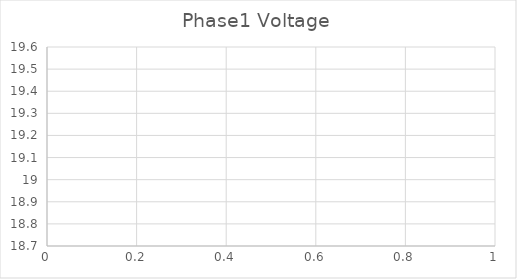
| Category | Phase1 Voltage |
|---|---|
| 0 | 19.384 |
| 1 | 19.386 |
| 2 | 19.392 |
| 3 | 19.393 |
| 4 | 19.385 |
| 5 | 19.382 |
| 6 | 19.375 |
| 7 | 19.376 |
| 8 | 19.385 |
| 9 | 19.391 |
| 10 | 19.393 |
| 11 | 19.396 |
| 12 | 19.393 |
| 13 | 19.386 |
| 14 | 19.386 |
| 15 | 19.399 |
| 16 | 19.406 |
| 17 | 19.404 |
| 18 | 19.398 |
| 19 | 19.395 |
| 20 | 19.395 |
| 21 | 19.399 |
| 22 | 19.397 |
| 23 | 19.391 |
| 24 | 19.39 |
| 25 | 19.39 |
| 26 | 19.381 |
| 27 | 19.385 |
| 28 | 19.391 |
| 29 | 19.395 |
| 30 | 19.395 |
| 31 | 19.386 |
| 32 | 19.379 |
| 33 | 19.376 |
| 34 | 19.378 |
| 35 | 19.382 |
| 36 | 19.383 |
| 37 | 19.378 |
| 38 | 19.38 |
| 39 | 19.385 |
| 40 | 19.385 |
| 41 | 19.395 |
| 42 | 19.398 |
| 43 | 19.406 |
| 44 | 19.413 |
| 45 | 19.424 |
| 46 | 19.431 |
| 47 | 19.432 |
| 48 | 19.431 |
| 49 | 19.422 |
| 50 | 19.413 |
| 51 | 19.402 |
| 52 | 19.402 |
| 53 | 19.414 |
| 54 | 19.42 |
| 55 | 19.422 |
| 56 | 19.429 |
| 57 | 19.432 |
| 58 | 19.442 |
| 59 | 19.446 |
| 60 | 19.448 |
| 61 | 19.446 |
| 62 | 19.446 |
| 63 | 19.443 |
| 64 | 19.447 |
| 65 | 19.446 |
| 66 | 19.435 |
| 67 | 19.431 |
| 68 | 19.425 |
| 69 | 19.425 |
| 70 | 19.432 |
| 71 | 19.435 |
| 72 | 19.435 |
| 73 | 19.441 |
| 74 | 19.445 |
| 75 | 19.445 |
| 76 | 19.449 |
| 77 | 19.442 |
| 78 | 19.441 |
| 79 | 19.44 |
| 80 | 19.439 |
| 81 | 19.441 |
| 82 | 19.441 |
| 83 | 19.443 |
| 84 | 19.446 |
| 85 | 19.441 |
| 86 | 19.438 |
| 87 | 19.436 |
| 88 | 19.444 |
| 89 | 19.447 |
| 90 | 19.45 |
| 91 | 19.45 |
| 92 | 19.451 |
| 93 | 19.452 |
| 94 | 19.446 |
| 95 | 19.445 |
| 96 | 19.45 |
| 97 | 19.451 |
| 98 | 19.453 |
| 99 | 19.455 |
| 100 | 19.453 |
| 101 | 19.457 |
| 102 | 19.458 |
| 103 | 19.462 |
| 104 | 19.462 |
| 105 | 19.462 |
| 106 | 19.465 |
| 107 | 19.472 |
| 108 | 19.476 |
| 109 | 19.474 |
| 110 | 19.472 |
| 111 | 19.468 |
| 112 | 19.467 |
| 113 | 19.468 |
| 114 | 19.467 |
| 115 | 19.465 |
| 116 | 19.457 |
| 117 | 19.459 |
| 118 | 19.463 |
| 119 | 19.46 |
| 120 | 19.454 |
| 121 | 19.454 |
| 122 | 19.451 |
| 123 | 19.446 |
| 124 | 19.449 |
| 125 | 19.452 |
| 126 | 19.456 |
| 127 | 19.457 |
| 128 | 19.457 |
| 129 | 19.457 |
| 130 | 19.462 |
| 131 | 19.464 |
| 132 | 19.462 |
| 133 | 19.462 |
| 134 | 19.457 |
| 135 | 19.456 |
| 136 | 19.459 |
| 137 | 19.455 |
| 138 | 19.456 |
| 139 | 19.462 |
| 140 | 19.466 |
| 141 | 19.465 |
| 142 | 19.457 |
| 143 | 19.458 |
| 144 | 19.46 |
| 145 | 19.466 |
| 146 | 19.467 |
| 147 | 19.469 |
| 148 | 19.467 |
| 149 | 19.47 |
| 150 | 19.47 |
| 151 | 19.473 |
| 152 | 19.472 |
| 153 | 19.472 |
| 154 | 19.464 |
| 155 | 19.457 |
| 156 | 19.455 |
| 157 | 19.455 |
| 158 | 19.463 |
| 159 | 19.462 |
| 160 | 19.457 |
| 161 | 19.453 |
| 162 | 19.45 |
| 163 | 19.449 |
| 164 | 19.454 |
| 165 | 19.451 |
| 166 | 19.451 |
| 167 | 19.454 |
| 168 | 19.464 |
| 169 | 19.464 |
| 170 | 19.46 |
| 171 | 19.454 |
| 172 | 19.454 |
| 173 | 19.461 |
| 174 | 19.461 |
| 175 | 19.459 |
| 176 | 19.46 |
| 177 | 19.463 |
| 178 | 19.473 |
| 179 | 19.476 |
| 180 | 19.478 |
| 181 | 19.482 |
| 182 | 19.482 |
| 183 | 19.483 |
| 184 | 19.485 |
| 185 | 19.484 |
| 186 | 19.485 |
| 187 | 19.49 |
| 188 | 19.49 |
| 189 | 19.488 |
| 190 | 19.491 |
| 191 | 19.506 |
| 192 | 19.508 |
| 193 | 19.495 |
| 194 | 19.489 |
| 195 | 19.485 |
| 196 | 19.485 |
| 197 | 19.482 |
| 198 | 19.48 |
| 199 | 19.481 |
| 200 | 19.482 |
| 201 | 19.484 |
| 202 | 19.477 |
| 203 | 19.474 |
| 204 | 19.473 |
| 205 | 19.472 |
| 206 | 19.473 |
| 207 | 19.473 |
| 208 | 19.476 |
| 209 | 19.479 |
| 210 | 19.48 |
| 211 | 19.473 |
| 212 | 19.47 |
| 213 | 19.475 |
| 214 | 19.48 |
| 215 | 19.483 |
| 216 | 19.48 |
| 217 | 19.479 |
| 218 | 19.483 |
| 219 | 19.48 |
| 220 | 19.475 |
| 221 | 19.478 |
| 222 | 19.477 |
| 223 | 19.473 |
| 224 | 19.47 |
| 225 | 19.47 |
| 226 | 19.472 |
| 227 | 19.473 |
| 228 | 19.471 |
| 229 | 19.468 |
| 230 | 19.462 |
| 231 | 19.459 |
| 232 | 19.444 |
| 233 | 19.463 |
| 234 | 19.466 |
| 235 | 19.468 |
| 236 | 19.467 |
| 237 | 19.469 |
| 238 | 19.474 |
| 239 | 19.476 |
| 240 | 19.476 |
| 241 | 19.478 |
| 242 | 19.48 |
| 243 | 19.484 |
| 244 | 19.482 |
| 245 | 19.478 |
| 246 | 19.471 |
| 247 | 19.471 |
| 248 | 19.47 |
| 249 | 19.465 |
| 250 | 19.463 |
| 251 | 19.466 |
| 252 | 19.464 |
| 253 | 19.464 |
| 254 | 19.459 |
| 255 | 19.456 |
| 256 | 19.449 |
| 257 | 19.445 |
| 258 | 19.439 |
| 259 | 19.436 |
| 260 | 19.439 |
| 261 | 19.444 |
| 262 | 19.454 |
| 263 | 19.457 |
| 264 | 19.461 |
| 265 | 19.461 |
| 266 | 19.46 |
| 267 | 19.463 |
| 268 | 19.463 |
| 269 | 19.461 |
| 270 | 19.468 |
| 271 | 19.471 |
| 272 | 19.471 |
| 273 | 19.472 |
| 274 | 19.477 |
| 275 | 19.483 |
| 276 | 19.48 |
| 277 | 19.47 |
| 278 | 19.469 |
| 279 | 19.474 |
| 280 | 19.481 |
| 281 | 19.481 |
| 282 | 19.479 |
| 283 | 19.478 |
| 284 | 19.473 |
| 285 | 19.471 |
| 286 | 19.476 |
| 287 | 19.48 |
| 288 | 19.482 |
| 289 | 19.484 |
| 290 | 19.491 |
| 291 | 19.494 |
| 292 | 19.494 |
| 293 | 19.487 |
| 294 | 19.486 |
| 295 | 19.484 |
| 296 | 19.475 |
| 297 | 19.473 |
| 298 | 19.473 |
| 299 | 19.47 |
| 300 | 19.479 |
| 301 | 19.484 |
| 302 | 19.485 |
| 303 | 19.487 |
| 304 | 19.496 |
| 305 | 19.495 |
| 306 | 19.514 |
| 307 | 19.522 |
| 308 | 19.513 |
| 309 | 19.513 |
| 310 | 19.514 |
| 311 | 19.516 |
| 312 | 19.517 |
| 313 | 19.516 |
| 314 | 19.514 |
| 315 | 19.51 |
| 316 | 19.504 |
| 317 | 19.506 |
| 318 | 19.508 |
| 319 | 19.507 |
| 320 | 19.503 |
| 321 | 19.501 |
| 322 | 19.5 |
| 323 | 19.5 |
| 324 | 19.499 |
| 325 | 19.494 |
| 326 | 19.494 |
| 327 | 19.495 |
| 328 | 19.49 |
| 329 | 19.491 |
| 330 | 19.495 |
| 331 | 19.496 |
| 332 | 19.501 |
| 333 | 19.498 |
| 334 | 19.494 |
| 335 | 19.492 |
| 336 | 19.489 |
| 337 | 19.487 |
| 338 | 19.489 |
| 339 | 19.487 |
| 340 | 19.484 |
| 341 | 19.49 |
| 342 | 19.493 |
| 343 | 19.491 |
| 344 | 19.49 |
| 345 | 19.488 |
| 346 | 19.487 |
| 347 | 19.49 |
| 348 | 19.492 |
| 349 | 19.493 |
| 350 | 19.492 |
| 351 | 19.488 |
| 352 | 19.487 |
| 353 | 19.485 |
| 354 | 19.479 |
| 355 | 19.475 |
| 356 | 19.47 |
| 357 | 19.462 |
| 358 | 19.463 |
| 359 | 19.463 |
| 360 | 19.467 |
| 361 | 19.466 |
| 362 | 19.467 |
| 363 | 19.466 |
| 364 | 19.461 |
| 365 | 19.457 |
| 366 | 19.452 |
| 367 | 19.452 |
| 368 | 19.454 |
| 369 | 19.458 |
| 370 | 19.455 |
| 371 | 19.444 |
| 372 | 19.441 |
| 373 | 19.449 |
| 374 | 19.454 |
| 375 | 19.454 |
| 376 | 19.452 |
| 377 | 19.444 |
| 378 | 19.443 |
| 379 | 19.441 |
| 380 | 19.421 |
| 381 | 19.435 |
| 382 | 19.432 |
| 383 | 19.427 |
| 384 | 19.428 |
| 385 | 19.43 |
| 386 | 19.43 |
| 387 | 19.43 |
| 388 | 19.436 |
| 389 | 19.438 |
| 390 | 19.44 |
| 391 | 19.442 |
| 392 | 19.447 |
| 393 | 19.455 |
| 394 | 19.455 |
| 395 | 19.454 |
| 396 | 19.449 |
| 397 | 19.446 |
| 398 | 19.45 |
| 399 | 19.452 |
| 400 | 19.454 |
| 401 | 19.455 |
| 402 | 19.453 |
| 403 | 19.453 |
| 404 | 19.45 |
| 405 | 19.45 |
| 406 | 19.453 |
| 407 | 19.451 |
| 408 | 19.453 |
| 409 | 19.46 |
| 410 | 19.46 |
| 411 | 19.452 |
| 412 | 19.449 |
| 413 | 19.447 |
| 414 | 19.449 |
| 415 | 19.45 |
| 416 | 19.444 |
| 417 | 19.429 |
| 418 | 19.426 |
| 419 | 19.402 |
| 420 | 19.398 |
| 421 | 19.418 |
| 422 | 19.421 |
| 423 | 19.422 |
| 424 | 19.428 |
| 425 | 19.43 |
| 426 | 19.435 |
| 427 | 19.441 |
| 428 | 19.442 |
| 429 | 19.439 |
| 430 | 19.438 |
| 431 | 19.439 |
| 432 | 19.435 |
| 433 | 19.43 |
| 434 | 19.424 |
| 435 | 19.425 |
| 436 | 19.429 |
| 437 | 19.43 |
| 438 | 19.43 |
| 439 | 19.432 |
| 440 | 19.434 |
| 441 | 19.435 |
| 442 | 19.431 |
| 443 | 19.417 |
| 444 | 19.414 |
| 445 | 19.413 |
| 446 | 19.396 |
| 447 | 19.388 |
| 448 | 19.38 |
| 449 | 19.363 |
| 450 | 19.343 |
| 451 | 19.323 |
| 452 | 19.304 |
| 453 | 19.301 |
| 454 | 19.296 |
| 455 | 19.301 |
| 456 | 19.319 |
| 457 | 19.329 |
| 458 | 19.341 |
| 459 | 19.349 |
| 460 | 19.35 |
| 461 | 19.354 |
| 462 | 19.356 |
| 463 | 19.364 |
| 464 | 19.366 |
| 465 | 19.368 |
| 466 | 19.357 |
| 467 | 19.349 |
| 468 | 19.342 |
| 469 | 19.334 |
| 470 | 19.328 |
| 471 | 19.33 |
| 472 | 19.331 |
| 473 | 19.331 |
| 474 | 19.326 |
| 475 | 19.323 |
| 476 | 19.32 |
| 477 | 19.32 |
| 478 | 19.32 |
| 479 | 19.325 |
| 480 | 19.329 |
| 481 | 19.331 |
| 482 | 19.33 |
| 483 | 19.32 |
| 484 | 19.308 |
| 485 | 19.303 |
| 486 | 19.306 |
| 487 | 19.307 |
| 488 | 19.307 |
| 489 | 19.303 |
| 490 | 19.299 |
| 491 | 19.299 |
| 492 | 19.301 |
| 493 | 19.299 |
| 494 | 19.296 |
| 495 | 19.295 |
| 496 | 19.284 |
| 497 | 19.286 |
| 498 | 19.29 |
| 499 | 19.289 |
| 500 | 19.405 |
| 501 | 19.41 |
| 502 | 19.421 |
| 503 | 19.403 |
| 504 | 19.402 |
| 505 | 19.402 |
| 506 | 19.406 |
| 507 | 19.412 |
| 508 | 19.417 |
| 509 | 19.419 |
| 510 | 19.424 |
| 511 | 19.424 |
| 512 | 19.425 |
| 513 | 19.428 |
| 514 | 19.43 |
| 515 | 19.417 |
| 516 | 19.415 |
| 517 | 19.411 |
| 518 | 19.409 |
| 519 | 19.41 |
| 520 | 19.416 |
| 521 | 19.415 |
| 522 | 19.412 |
| 523 | 19.41 |
| 524 | 19.409 |
| 525 | 19.41 |
| 526 | 19.411 |
| 527 | 19.411 |
| 528 | 19.408 |
| 529 | 19.408 |
| 530 | 19.41 |
| 531 | 19.411 |
| 532 | 19.409 |
| 533 | 19.409 |
| 534 | 19.404 |
| 535 | 19.404 |
| 536 | 19.407 |
| 537 | 19.407 |
| 538 | 19.353 |
| 539 | 19.336 |
| 540 | 19.336 |
| 541 | 19.279 |
| 542 | 19.275 |
| 543 | 19.279 |
| 544 | 19.284 |
| 545 | 19.294 |
| 546 | 19.301 |
| 547 | 19.297 |
| 548 | 19.295 |
| 549 | 19.295 |
| 550 | 18.837 |
| 551 | 18.833 |
| 552 | 19.293 |
| 553 | 19.295 |
| 554 | 19.293 |
| 555 | 19.292 |
| 556 | 19.287 |
| 557 | 19.289 |
| 558 | 19.289 |
| 559 | 19.29 |
| 560 | 19.291 |
| 561 | 19.287 |
| 562 | 19.286 |
| 563 | 19.292 |
| 564 | 19.293 |
| 565 | 19.299 |
| 566 | 19.3 |
| 567 | 19.298 |
| 568 | 19.296 |
| 569 | 19.299 |
| 570 | 19.186 |
| 571 | 19.156 |
| 572 | 19.156 |
| 573 | 19.299 |
| 574 | 19.404 |
| 575 | 19.399 |
| 576 | 19.367 |
| 577 | 19.366 |
| 578 | 19.391 |
| 579 | 19.397 |
| 580 | 19.343 |
| 581 | 19.343 |
| 582 | 19.364 |
| 583 | 19.358 |
| 584 | 19.377 |
| 585 | 19.398 |
| 586 | 19.411 |
| 587 | 19.42 |
| 588 | 19.437 |
| 589 | 19.451 |
| 590 | 19.458 |
| 591 | 19.467 |
| 592 | 19.47 |
| 593 | 19.469 |
| 594 | 19.466 |
| 595 | 19.457 |
| 596 | 19.459 |
| 597 | 19.467 |
| 598 | 19.468 |
| 599 | 19.471 |
| 600 | 19.47 |
| 601 | 19.468 |
| 602 | 19.467 |
| 603 | 19.465 |
| 604 | 19.462 |
| 605 | 19.466 |
| 606 | 19.465 |
| 607 | 19.466 |
| 608 | 19.472 |
| 609 | 19.48 |
| 610 | 19.482 |
| 611 | 19.487 |
| 612 | 19.483 |
| 613 | 19.478 |
| 614 | 19.474 |
| 615 | 19.471 |
| 616 | 19.476 |
| 617 | 19.488 |
| 618 | 19.483 |
| 619 | 19.473 |
| 620 | 19.469 |
| 621 | 19.477 |
| 622 | 19.482 |
| 623 | 19.477 |
| 624 | 19.457 |
| 625 | 19.46 |
| 626 | 19.475 |
| 627 | 19.48 |
| 628 | 19.465 |
| 629 | 19.465 |
| 630 | 19.475 |
| 631 | 19.474 |
| 632 | 19.468 |
| 633 | 19.477 |
| 634 | 19.48 |
| 635 | 19.504 |
| 636 | 19.491 |
| 637 | 19.469 |
| 638 | 19.471 |
| 639 | 19.472 |
| 640 | 19.473 |
| 641 | 19.478 |
| 642 | 19.478 |
| 643 | 19.476 |
| 644 | 19.473 |
| 645 | 19.48 |
| 646 | 19.484 |
| 647 | 19.48 |
| 648 | 19.475 |
| 649 | 19.48 |
| 650 | 19.479 |
| 651 | 19.477 |
| 652 | 19.477 |
| 653 | 19.476 |
| 654 | 19.479 |
| 655 | 19.473 |
| 656 | 19.47 |
| 657 | 19.467 |
| 658 | 19.471 |
| 659 | 19.473 |
| 660 | 19.471 |
| 661 | 19.461 |
| 662 | 19.458 |
| 663 | 19.454 |
| 664 | 19.456 |
| 665 | 19.458 |
| 666 | 19.447 |
| 667 | 19.442 |
| 668 | 19.447 |
| 669 | 19.448 |
| 670 | 19.457 |
| 671 | 19.455 |
| 672 | 19.448 |
| 673 | 19.442 |
| 674 | 19.427 |
| 675 | 19.427 |
| 676 | 19.435 |
| 677 | 19.439 |
| 678 | 19.448 |
| 679 | 19.449 |
| 680 | 19.447 |
| 681 | 19.437 |
| 682 | 19.434 |
| 683 | 19.434 |
| 684 | 19.439 |
| 685 | 19.441 |
| 686 | 19.437 |
| 687 | 19.439 |
| 688 | 19.445 |
| 689 | 19.445 |
| 690 | 19.44 |
| 691 | 19.435 |
| 692 | 19.436 |
| 693 | 19.436 |
| 694 | 19.435 |
| 695 | 19.442 |
| 696 | 19.445 |
| 697 | 19.454 |
| 698 | 19.449 |
| 699 | 19.447 |
| 700 | 19.446 |
| 701 | 19.445 |
| 702 | 19.445 |
| 703 | 19.442 |
| 704 | 19.441 |
| 705 | 19.439 |
| 706 | 19.435 |
| 707 | 19.431 |
| 708 | 19.432 |
| 709 | 19.433 |
| 710 | 19.439 |
| 711 | 19.442 |
| 712 | 19.44 |
| 713 | 19.443 |
| 714 | 19.445 |
| 715 | 19.444 |
| 716 | 19.44 |
| 717 | 19.44 |
| 718 | 19.435 |
| 719 | 19.431 |
| 720 | 19.43 |
| 721 | 19.438 |
| 722 | 19.443 |
| 723 | 19.441 |
| 724 | 19.443 |
| 725 | 19.452 |
| 726 | 19.454 |
| 727 | 19.459 |
| 728 | 19.468 |
| 729 | 19.474 |
| 730 | 19.476 |
| 731 | 19.474 |
| 732 | 19.474 |
| 733 | 19.474 |
| 734 | 19.472 |
| 735 | 19.465 |
| 736 | 19.463 |
| 737 | 19.467 |
| 738 | 19.47 |
| 739 | 19.462 |
| 740 | 19.459 |
| 741 | 19.456 |
| 742 | 19.457 |
| 743 | 19.466 |
| 744 | 19.466 |
| 745 | 19.46 |
| 746 | 19.454 |
| 747 | 19.452 |
| 748 | 19.458 |
| 749 | 19.468 |
| 750 | 19.472 |
| 751 | 19.469 |
| 752 | 19.474 |
| 753 | 19.475 |
| 754 | 19.474 |
| 755 | 19.467 |
| 756 | 19.467 |
| 757 | 19.466 |
| 758 | 19.477 |
| 759 | 19.479 |
| 760 | 19.478 |
| 761 | 19.471 |
| 762 | 19.467 |
| 763 | 19.478 |
| 764 | 19.478 |
| 765 | 19.489 |
| 766 | 19.489 |
| 767 | 19.483 |
| 768 | 19.48 |
| 769 | 19.48 |
| 770 | 19.47 |
| 771 | 19.454 |
| 772 | 19.445 |
| 773 | 19.415 |
| 774 | 19.418 |
| 775 | 19.458 |
| 776 | 19.477 |
| 777 | 19.528 |
| 778 | 19.524 |
| 779 | 19.488 |
| 780 | 19.475 |
| 781 | 19.465 |
| 782 | 19.474 |
| 783 | 19.485 |
| 784 | 19.453 |
| 785 | 19.438 |
| 786 | 19.447 |
| 787 | 19.448 |
| 788 | 19.438 |
| 789 | 19.381 |
| 790 | 19.362 |
| 791 | 19.378 |
| 792 | 19.379 |
| 793 | 19.392 |
| 794 | 19.406 |
| 795 | 19.453 |
| 796 | 19.479 |
| 797 | 19.508 |
| 798 | 19.508 |
| 799 | 19.492 |
| 800 | 19.495 |
| 801 | 19.497 |
| 802 | 19.488 |
| 803 | 19.469 |
| 804 | 19.449 |
| 805 | 19.393 |
| 806 | 19.351 |
| 807 | 19.305 |
| 808 | 19.318 |
| 809 | 19.341 |
| 810 | 19.377 |
| 811 | 19.413 |
| 812 | 19.463 |
| 813 | 19.499 |
| 814 | 19.536 |
| 815 | 19.514 |
| 816 | 19.493 |
| 817 | 19.47 |
| 818 | 19.455 |
| 819 | 19.445 |
| 820 | 19.439 |
| 821 | 19.443 |
| 822 | 19.447 |
| 823 | 19.446 |
| 824 | 19.434 |
| 825 | 19.427 |
| 826 | 19.422 |
| 827 | 19.409 |
| 828 | 19.417 |
| 829 | 19.425 |
| 830 | 19.451 |
| 831 | 19.458 |
| 832 | 19.461 |
| 833 | 19.451 |
| 834 | 19.451 |
| 835 | 19.455 |
| 836 | 19.457 |
| 837 | 19.462 |
| 838 | 19.456 |
| 839 | 19.443 |
| 840 | 19.442 |
| 841 | 19.436 |
| 842 | 19.421 |
| 843 | 19.414 |
| 844 | 19.415 |
| 845 | 19.429 |
| 846 | 19.436 |
| 847 | 19.438 |
| 848 | 19.444 |
| 849 | 19.454 |
| 850 | 19.469 |
| 851 | 19.462 |
| 852 | 19.401 |
| 853 | 19.399 |
| 854 | 19.399 |
| 855 | 19.443 |
| 856 | 19.445 |
| 857 | 19.444 |
| 858 | 19.438 |
| 859 | 19.425 |
| 860 | 19.417 |
| 861 | 19.368 |
| 862 | 19.423 |
| 863 | 19.43 |
| 864 | 19.437 |
| 865 | 19.437 |
| 866 | 19.436 |
| 867 | 19.426 |
| 868 | 19.42 |
| 869 | 19.42 |
| 870 | 19.421 |
| 871 | 19.418 |
| 872 | 19.415 |
| 873 | 19.422 |
| 874 | 19.424 |
| 875 | 19.431 |
| 876 | 19.432 |
| 877 | 19.429 |
| 878 | 19.425 |
| 879 | 19.425 |
| 880 | 19.412 |
| 881 | 19.408 |
| 882 | 19.403 |
| 883 | 19.404 |
| 884 | 19.411 |
| 885 | 19.418 |
| 886 | 19.43 |
| 887 | 19.43 |
| 888 | 19.43 |
| 889 | 19.428 |
| 890 | 19.428 |
| 891 | 19.431 |
| 892 | 19.431 |
| 893 | 19.43 |
| 894 | 19.426 |
| 895 | 19.42 |
| 896 | 19.413 |
| 897 | 19.415 |
| 898 | 19.415 |
| 899 | 19.414 |
| 900 | 19.414 |
| 901 | 19.411 |
| 902 | 19.408 |
| 903 | 19.409 |
| 904 | 19.413 |
| 905 | 19.413 |
| 906 | 19.415 |
| 907 | 19.415 |
| 908 | 19.413 |
| 909 | 19.411 |
| 910 | 19.408 |
| 911 | 19.386 |
| 912 | 19.386 |
| 913 | 19.406 |
| 914 | 19.417 |
| 915 | 19.416 |
| 916 | 19.413 |
| 917 | 19.413 |
| 918 | 19.41 |
| 919 | 19.408 |
| 920 | 19.411 |
| 921 | 19.41 |
| 922 | 19.412 |
| 923 | 19.413 |
| 924 | 19.41 |
| 925 | 19.405 |
| 926 | 19.393 |
| 927 | 19.388 |
| 928 | 19.382 |
| 929 | 19.388 |
| 930 | 19.39 |
| 931 | 19.388 |
| 932 | 19.385 |
| 933 | 19.387 |
| 934 | 19.388 |
| 935 | 19.374 |
| 936 | 19.374 |
| 937 | 19.386 |
| 938 | 19.396 |
| 939 | 19.402 |
| 940 | 19.398 |
| 941 | 19.398 |
| 942 | 19.405 |
| 943 | 19.405 |
| 944 | 19.404 |
| 945 | 19.407 |
| 946 | 19.413 |
| 947 | 19.414 |
| 948 | 19.413 |
| 949 | 19.407 |
| 950 | 19.4 |
| 951 | 19.399 |
| 952 | 19.399 |
| 953 | 19.395 |
| 954 | 19.394 |
| 955 | 19.393 |
| 956 | 19.394 |
| 957 | 19.395 |
| 958 | 19.394 |
| 959 | 19.389 |
| 960 | 19.388 |
| 961 | 19.383 |
| 962 | 19.38 |
| 963 | 19.385 |
| 964 | 19.389 |
| 965 | 19.389 |
| 966 | 19.382 |
| 967 | 19.379 |
| 968 | 19.38 |
| 969 | 19.38 |
| 970 | 19.379 |
| 971 | 19.374 |
| 972 | 19.374 |
| 973 | 19.376 |
| 974 | 19.375 |
| 975 | 19.377 |
| 976 | 19.38 |
| 977 | 19.39 |
| 978 | 19.392 |
| 979 | 19.39 |
| 980 | 19.386 |
| 981 | 19.388 |
| 982 | 19.381 |
| 983 | 19.381 |
| 984 | 19.378 |
| 985 | 19.382 |
| 986 | 19.38 |
| 987 | 19.369 |
| 988 | 19.369 |
| 989 | 19.376 |
| 990 | 19.373 |
| 991 | 19.37 |
| 992 | 19.366 |
| 993 | 19.371 |
| 994 | 19.378 |
| 995 | 19.38 |
| 996 | 19.378 |
| 997 | 19.374 |
| 998 | 19.375 |
| 999 | 19.375 |
| 1000 | 19.375 |
| 1001 | 19.366 |
| 1002 | 19.36 |
| 1003 | 19.358 |
| 1004 | 19.357 |
| 1005 | 19.362 |
| 1006 | 19.365 |
| 1007 | 19.364 |
| 1008 | 19.364 |
| 1009 | 19.368 |
| 1010 | 19.377 |
| 1011 | 19.381 |
| 1012 | 19.379 |
| 1013 | 19.377 |
| 1014 | 19.381 |
| 1015 | 19.384 |
| 1016 | 19.382 |
| 1017 | 19.381 |
| 1018 | 19.38 |
| 1019 | 19.383 |
| 1020 | 19.384 |
| 1021 | 19.381 |
| 1022 | 19.378 |
| 1023 | 19.378 |
| 1024 | 19.378 |
| 1025 | 19.379 |
| 1026 | 19.38 |
| 1027 | 19.38 |
| 1028 | 19.385 |
| 1029 | 19.386 |
| 1030 | 19.381 |
| 1031 | 19.378 |
| 1032 | 19.374 |
| 1033 | 19.369 |
| 1034 | 19.372 |
| 1035 | 19.372 |
| 1036 | 19.372 |
| 1037 | 19.373 |
| 1038 | 19.377 |
| 1039 | 19.379 |
| 1040 | 19.377 |
| 1041 | 19.374 |
| 1042 | 19.365 |
| 1043 | 19.363 |
| 1044 | 19.362 |
| 1045 | 19.363 |
| 1046 | 19.369 |
| 1047 | 19.362 |
| 1048 | 19.359 |
| 1049 | 19.358 |
| 1050 | 19.356 |
| 1051 | 19.355 |
| 1052 | 19.35 |
| 1053 | 19.345 |
| 1054 | 19.339 |
| 1055 | 19.337 |
| 1056 | 19.337 |
| 1057 | 19.335 |
| 1058 | 19.336 |
| 1059 | 19.34 |
| 1060 | 19.346 |
| 1061 | 19.346 |
| 1062 | 19.342 |
| 1063 | 19.339 |
| 1064 | 19.337 |
| 1065 | 19.337 |
| 1066 | 19.337 |
| 1067 | 19.334 |
| 1068 | 19.332 |
| 1069 | 19.33 |
| 1070 | 19.327 |
| 1071 | 19.325 |
| 1072 | 19.32 |
| 1073 | 19.324 |
| 1074 | 19.327 |
| 1075 | 19.327 |
| 1076 | 19.325 |
| 1077 | 19.324 |
| 1078 | 19.324 |
| 1079 | 19.32 |
| 1080 | 19.319 |
| 1081 | 19.315 |
| 1082 | 19.314 |
| 1083 | 19.314 |
| 1084 | 19.313 |
| 1085 | 19.314 |
| 1086 | 19.313 |
| 1087 | 19.314 |
| 1088 | 19.314 |
| 1089 | 19.313 |
| 1090 | 19.316 |
| 1091 | 19.318 |
| 1092 | 19.32 |
| 1093 | 19.32 |
| 1094 | 19.319 |
| 1095 | 19.315 |
| 1096 | 19.314 |
| 1097 | 19.314 |
| 1098 | 19.314 |
| 1099 | 19.31 |
| 1100 | 19.308 |
| 1101 | 19.304 |
| 1102 | 19.305 |
| 1103 | 19.307 |
| 1104 | 19.308 |
| 1105 | 19.31 |
| 1106 | 19.315 |
| 1107 | 19.317 |
| 1108 | 19.324 |
| 1109 | 19.325 |
| 1110 | 19.327 |
| 1111 | 19.325 |
| 1112 | 19.325 |
| 1113 | 19.332 |
| 1114 | 19.337 |
| 1115 | 19.334 |
| 1116 | 19.332 |
| 1117 | 19.332 |
| 1118 | 19.33 |
| 1119 | 19.325 |
| 1120 | 19.325 |
| 1121 | 19.324 |
| 1122 | 19.313 |
| 1123 | 19.31 |
| 1124 | 19.302 |
| 1125 | 19.298 |
| 1126 | 19.298 |
| 1127 | 19.297 |
| 1128 | 19.291 |
| 1129 | 19.289 |
| 1130 | 19.285 |
| 1131 | 19.284 |
| 1132 | 19.284 |
| 1133 | 19.28 |
| 1134 | 19.278 |
| 1135 | 19.271 |
| 1136 | 19.244 |
| 1137 | 19.243 |
| 1138 | 19.265 |
| 1139 | 19.267 |
| 1140 | 19.267 |
| 1141 | 19.27 |
| 1142 | 19.271 |
| 1143 | 19.286 |
| 1144 | 19.286 |
| 1145 | 19.271 |
| 1146 | 19.271 |
| 1147 | 19.279 |
| 1148 | 19.288 |
| 1149 | 19.289 |
| 1150 | 19.295 |
| 1151 | 19.302 |
| 1152 | 19.302 |
| 1153 | 19.301 |
| 1154 | 19.302 |
| 1155 | 19.305 |
| 1156 | 19.305 |
| 1157 | 19.309 |
| 1158 | 19.312 |
| 1159 | 19.309 |
| 1160 | 19.307 |
| 1161 | 19.311 |
| 1162 | 19.31 |
| 1163 | 19.312 |
| 1164 | 19.314 |
| 1165 | 19.313 |
| 1166 | 19.308 |
| 1167 | 19.306 |
| 1168 | 19.297 |
| 1169 | 19.299 |
| 1170 | 19.305 |
| 1171 | 19.306 |
| 1172 | 19.308 |
| 1173 | 19.309 |
| 1174 | 19.31 |
| 1175 | 19.312 |
| 1176 | 19.31 |
| 1177 | 19.309 |
| 1178 | 19.31 |
| 1179 | 19.308 |
| 1180 | 19.307 |
| 1181 | 19.308 |
| 1182 | 19.311 |
| 1183 | 19.314 |
| 1184 | 19.314 |
| 1185 | 19.315 |
| 1186 | 19.319 |
| 1187 | 19.314 |
| 1188 | 19.316 |
| 1189 | 19.318 |
| 1190 | 19.313 |
| 1191 | 19.306 |
| 1192 | 19.304 |
| 1193 | 19.305 |
| 1194 | 19.301 |
| 1195 | 19.3 |
| 1196 | 19.296 |
| 1197 | 19.298 |
| 1198 | 19.302 |
| 1199 | 19.3 |
| 1200 | 19.298 |
| 1201 | 19.295 |
| 1202 | 19.295 |
| 1203 | 19.301 |
| 1204 | 19.303 |
| 1205 | 19.305 |
| 1206 | 19.303 |
| 1207 | 19.304 |
| 1208 | 19.309 |
| 1209 | 19.311 |
| 1210 | 19.308 |
| 1211 | 19.306 |
| 1212 | 19.303 |
| 1213 | 19.31 |
| 1214 | 19.316 |
| 1215 | 19.321 |
| 1216 | 19.318 |
| 1217 | 19.318 |
| 1218 | 19.321 |
| 1219 | 19.324 |
| 1220 | 19.324 |
| 1221 | 19.324 |
| 1222 | 19.317 |
| 1223 | 19.318 |
| 1224 | 19.324 |
| 1225 | 19.325 |
| 1226 | 19.326 |
| 1227 | 19.326 |
| 1228 | 19.324 |
| 1229 | 19.329 |
| 1230 | 19.331 |
| 1231 | 19.328 |
| 1232 | 19.324 |
| 1233 | 19.326 |
| 1234 | 19.33 |
| 1235 | 19.328 |
| 1236 | 19.328 |
| 1237 | 19.328 |
| 1238 | 19.332 |
| 1239 | 19.335 |
| 1240 | 19.334 |
| 1241 | 19.334 |
| 1242 | 19.333 |
| 1243 | 19.333 |
| 1244 | 19.335 |
| 1245 | 19.337 |
| 1246 | 19.34 |
| 1247 | 19.339 |
| 1248 | 19.338 |
| 1249 | 19.338 |
| 1250 | 19.338 |
| 1251 | 19.343 |
| 1252 | 19.349 |
| 1253 | 19.349 |
| 1254 | 19.349 |
| 1255 | 19.349 |
| 1256 | 19.345 |
| 1257 | 19.34 |
| 1258 | 19.342 |
| 1259 | 19.346 |
| 1260 | 19.349 |
| 1261 | 19.354 |
| 1262 | 19.356 |
| 1263 | 19.357 |
| 1264 | 19.354 |
| 1265 | 19.357 |
| 1266 | 19.352 |
| 1267 | 19.348 |
| 1268 | 19.34 |
| 1269 | 19.345 |
| 1270 | 19.349 |
| 1271 | 19.355 |
| 1272 | 19.357 |
| 1273 | 19.359 |
| 1274 | 19.36 |
| 1275 | 19.361 |
| 1276 | 19.357 |
| 1277 | 19.353 |
| 1278 | 19.352 |
| 1279 | 19.349 |
| 1280 | 19.35 |
| 1281 | 19.351 |
| 1282 | 19.345 |
| 1283 | 19.344 |
| 1284 | 19.347 |
| 1285 | 19.343 |
| 1286 | 19.342 |
| 1287 | 19.347 |
| 1288 | 19.344 |
| 1289 | 19.343 |
| 1290 | 19.345 |
| 1291 | 19.35 |
| 1292 | 19.35 |
| 1293 | 19.353 |
| 1294 | 19.355 |
| 1295 | 19.356 |
| 1296 | 19.356 |
| 1297 | 19.353 |
| 1298 | 19.352 |
| 1299 | 19.354 |
| 1300 | 19.356 |
| 1301 | 19.353 |
| 1302 | 19.349 |
| 1303 | 19.347 |
| 1304 | 19.348 |
| 1305 | 19.348 |
| 1306 | 19.346 |
| 1307 | 19.344 |
| 1308 | 19.344 |
| 1309 | 19.342 |
| 1310 | 19.344 |
| 1311 | 19.347 |
| 1312 | 19.344 |
| 1313 | 19.342 |
| 1314 | 19.341 |
| 1315 | 19.342 |
| 1316 | 19.343 |
| 1317 | 19.345 |
| 1318 | 19.347 |
| 1319 | 19.348 |
| 1320 | 19.345 |
| 1321 | 19.343 |
| 1322 | 19.339 |
| 1323 | 19.34 |
| 1324 | 19.34 |
| 1325 | 19.347 |
| 1326 | 19.352 |
| 1327 | 19.349 |
| 1328 | 19.349 |
| 1329 | 19.35 |
| 1330 | 19.354 |
| 1331 | 19.351 |
| 1332 | 19.352 |
| 1333 | 19.358 |
| 1334 | 19.362 |
| 1335 | 19.354 |
| 1336 | 19.353 |
| 1337 | 19.356 |
| 1338 | 19.357 |
| 1339 | 19.361 |
| 1340 | 19.363 |
| 1341 | 19.368 |
| 1342 | 19.368 |
| 1343 | 19.368 |
| 1344 | 19.369 |
| 1345 | 19.375 |
| 1346 | 19.379 |
| 1347 | 19.388 |
| 1348 | 19.39 |
| 1349 | 19.389 |
| 1350 | 19.408 |
| 1351 | 19.408 |
| 1352 | 19.408 |
| 1353 | 19.406 |
| 1354 | 19.406 |
| 1355 | 19.4 |
| 1356 | 19.402 |
| 1357 | 19.406 |
| 1358 | 19.403 |
| 1359 | 19.4 |
| 1360 | 19.398 |
| 1361 | 19.407 |
| 1362 | 19.409 |
| 1363 | 19.409 |
| 1364 | 19.407 |
| 1365 | 19.408 |
| 1366 | 19.409 |
| 1367 | 19.406 |
| 1368 | 19.406 |
| 1369 | 19.411 |
| 1370 | 19.413 |
| 1371 | 19.417 |
| 1372 | 19.419 |
| 1373 | 19.42 |
| 1374 | 19.417 |
| 1375 | 19.413 |
| 1376 | 19.413 |
| 1377 | 19.417 |
| 1378 | 19.421 |
| 1379 | 19.419 |
| 1380 | 19.418 |
| 1381 | 19.418 |
| 1382 | 19.426 |
| 1383 | 19.432 |
| 1384 | 19.434 |
| 1385 | 19.436 |
| 1386 | 19.441 |
| 1387 | 19.447 |
| 1388 | 19.442 |
| 1389 | 19.437 |
| 1390 | 19.44 |
| 1391 | 19.438 |
| 1392 | 19.445 |
| 1393 | 19.445 |
| 1394 | 19.442 |
| 1395 | 19.438 |
| 1396 | 19.444 |
| 1397 | 19.449 |
| 1398 | 19.455 |
| 1399 | 19.451 |
| 1400 | 19.45 |
| 1401 | 19.452 |
| 1402 | 19.454 |
| 1403 | 19.455 |
| 1404 | 19.454 |
| 1405 | 19.45 |
| 1406 | 19.45 |
| 1407 | 19.454 |
| 1408 | 19.459 |
| 1409 | 19.464 |
| 1410 | 19.47 |
| 1411 | 19.473 |
| 1412 | 19.48 |
| 1413 | 19.481 |
| 1414 | 19.477 |
| 1415 | 19.473 |
| 1416 | 19.469 |
| 1417 | 19.468 |
| 1418 | 19.464 |
| 1419 | 19.462 |
| 1420 | 19.462 |
| 1421 | 19.466 |
| 1422 | 19.466 |
| 1423 | 19.466 |
| 1424 | 19.468 |
| 1425 | 19.47 |
| 1426 | 19.471 |
| 1427 | 19.476 |
| 1428 | 19.477 |
| 1429 | 19.477 |
| 1430 | 19.473 |
| 1431 | 19.471 |
| 1432 | 19.456 |
| 1433 | 19.445 |
| 1434 | 19.428 |
| 1435 | 19.42 |
| 1436 | 19.427 |
| 1437 | 19.427 |
| 1438 | 19.422 |
| 1439 | 19.414 |
| 1440 | 19.409 |
| 1441 | 19.414 |
| 1442 | 19.414 |
| 1443 | 19.411 |
| 1444 | 19.42 |
| 1445 | 19.422 |
| 1446 | 19.422 |
| 1447 | 19.426 |
| 1448 | 19.421 |
| 1449 | 19.418 |
| 1450 | 19.421 |
| 1451 | 19.421 |
| 1452 | 19.423 |
| 1453 | 19.429 |
| 1454 | 19.427 |
| 1455 | 19.424 |
| 1456 | 19.425 |
| 1457 | 19.428 |
| 1458 | 19.431 |
| 1459 | 19.436 |
| 1460 | 19.433 |
| 1461 | 19.432 |
| 1462 | 19.431 |